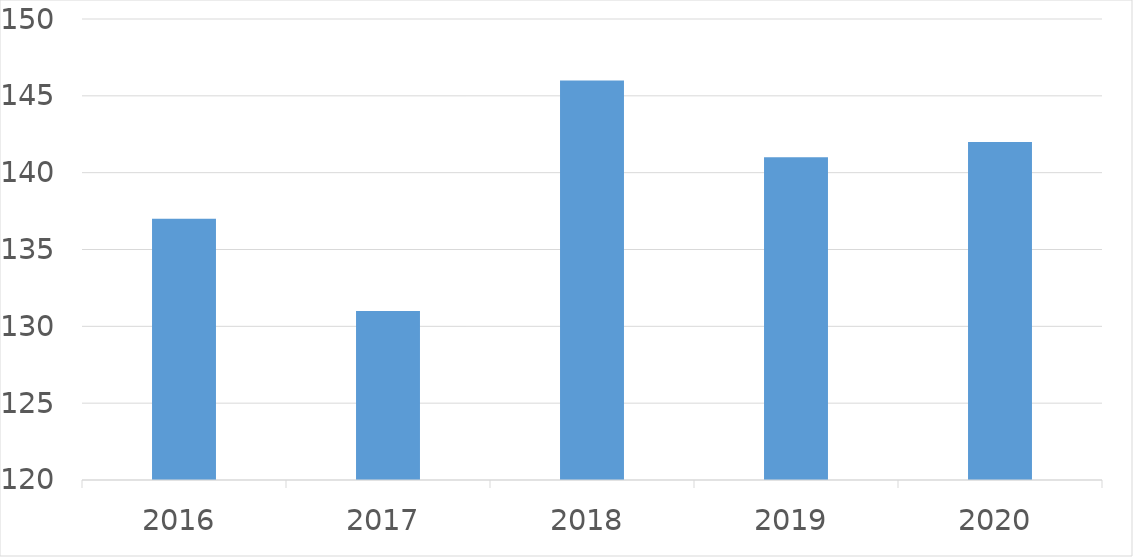
| Category | Series 0 |
|---|---|
| 2016 | 137 |
| 2017 | 131 |
| 2018 | 146 |
| 2019 | 141 |
| 2020 | 142 |